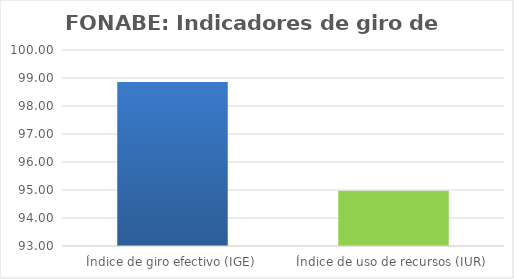
| Category | Series 0 |
|---|---|
| Índice de giro efectivo (IGE) | 98.853 |
| Índice de uso de recursos (IUR)  | 94.971 |